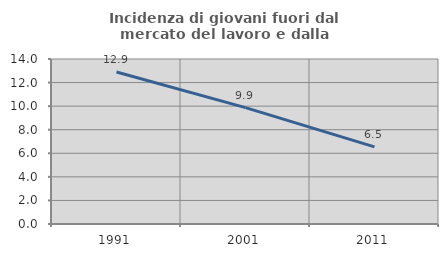
| Category | Incidenza di giovani fuori dal mercato del lavoro e dalla formazione  |
|---|---|
| 1991.0 | 12.896 |
| 2001.0 | 9.873 |
| 2011.0 | 6.542 |